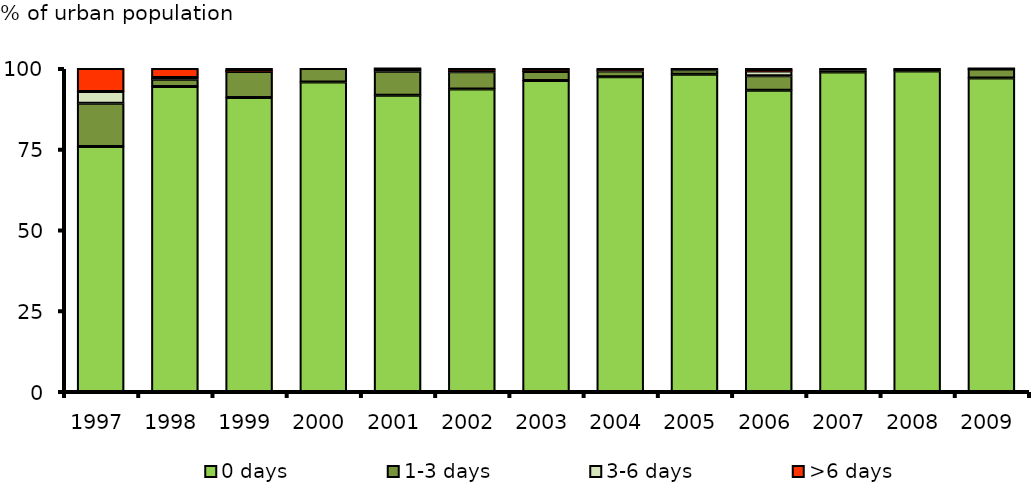
| Category | 0 days | 1-3 days | 3-6 days | >6 days |
|---|---|---|---|---|
| 1997.0 | 75.875 | 13.391 | 3.582 | 7.152 |
| 1998.0 | 94.425 | 2.275 | 0.475 | 2.825 |
| 1999.0 | 91.026 | 8.019 | 0.203 | 0.752 |
| 2000.0 | 95.818 | 4.182 | 0 | 0 |
| 2001.0 | 91.742 | 7.38 | 0.724 | 0.154 |
| 2002.0 | 93.661 | 5.294 | 0.649 | 0.396 |
| 2003.0 | 96.284 | 2.809 | 0.51 | 0.397 |
| 2004.0 | 97.436 | 1.81 | 0.39 | 0.363 |
| 2005.0 | 98.249 | 1.344 | 0.407 | 0 |
| 2006.0 | 93.26 | 4.475 | 1.457 | 0.808 |
| 2007.0 | 98.944 | 0.699 | 0.357 | 0 |
| 2008.0 | 99.194 | 0.468 | 0.338 | 0 |
| 2009.0 | 97.043 | 2.811 | 0 | 0.146 |